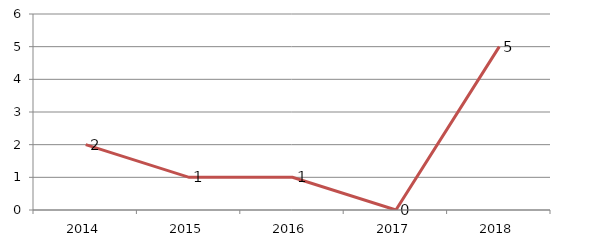
| Category | Total |
|---|---|
| 2014.0 | 2 |
| 2015.0 | 1 |
| 2016.0 | 1 |
| 2017.0 | 0 |
| 2018.0 | 5 |